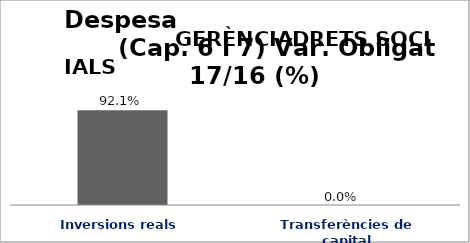
| Category | Series 0 |
|---|---|
| Inversions reals | 0.921 |
| Transferències de capital | 0 |